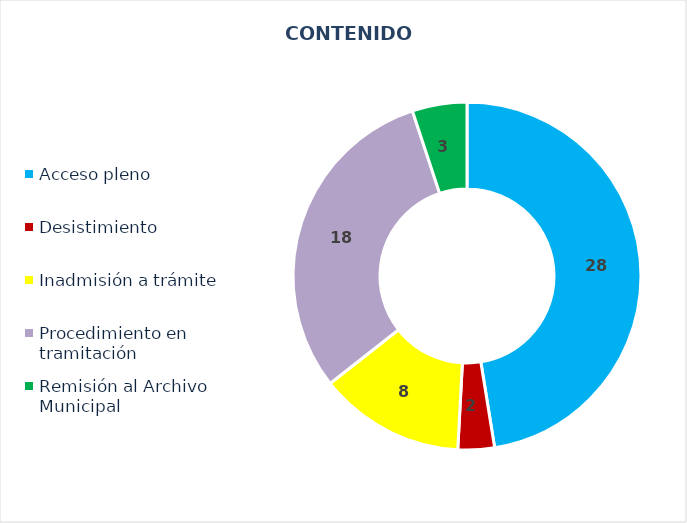
| Category | NÚMERO |
|---|---|
| Acceso pleno | 28 |
| Desistimiento | 2 |
| Inadmisión a trámite | 8 |
| Procedimiento en tramitación | 18 |
| Remisión al Archivo Municipal | 3 |